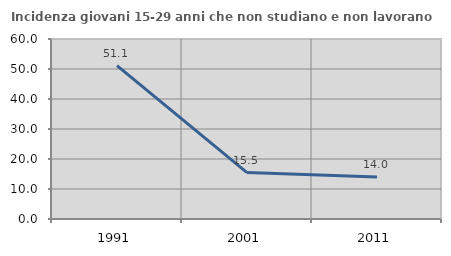
| Category | Incidenza giovani 15-29 anni che non studiano e non lavorano  |
|---|---|
| 1991.0 | 51.128 |
| 2001.0 | 15.476 |
| 2011.0 | 13.974 |